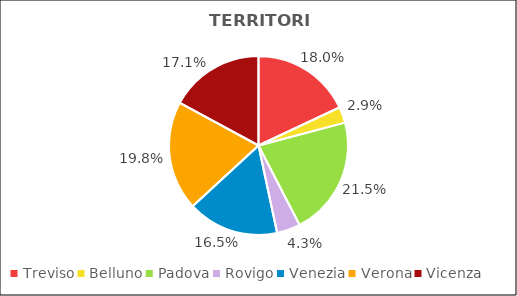
| Category | Series 0 |
|---|---|
| Treviso | 28997 |
| Belluno | 4644 |
| Padova | 34646 |
| Rovigo | 6858 |
| Venezia | 26555 |
| Verona | 31813 |
| Vicenza | 27536 |